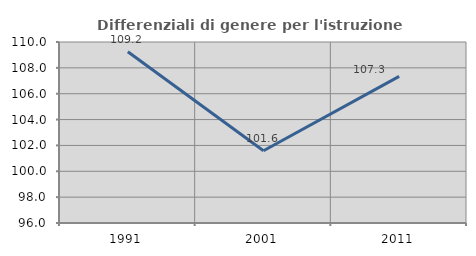
| Category | Differenziali di genere per l'istruzione superiore |
|---|---|
| 1991.0 | 109.25 |
| 2001.0 | 101.587 |
| 2011.0 | 107.337 |